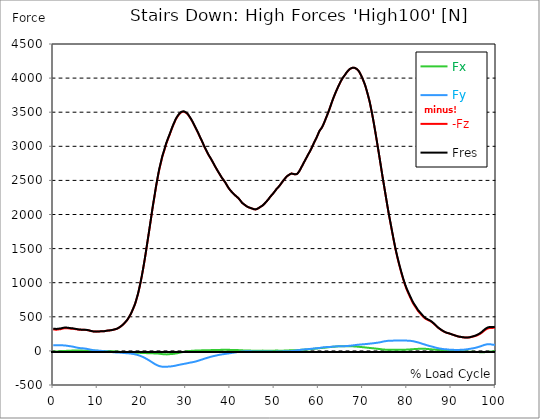
| Category |  Fx |  Fy |  -Fz |  Fres |
|---|---|---|---|---|
| 0.0 | -10.262 | 84.276 | 312.61 | 324.099 |
| 0.167348456675344 | -9.991 | 84.443 | 312.683 | 324.202 |
| 0.334696913350688 | -9.638 | 84.463 | 312.413 | 323.943 |
| 0.5020453700260321 | -8.972 | 83.944 | 310.884 | 322.31 |
| 0.669393826701376 | -8.369 | 83.767 | 310.759 | 322.134 |
| 0.83674228337672 | -7.725 | 83.548 | 311.456 | 322.757 |
| 1.0040907400520642 | -6.997 | 83.6 | 313.525 | 324.764 |
| 1.1621420602454444 | -6.311 | 83.372 | 315.376 | 326.5 |
| 1.3294905169207885 | -5.614 | 82.841 | 316.675 | 327.613 |
| 1.4968389735961325 | -4.824 | 82.28 | 317.549 | 328.309 |
| 1.6641874302714765 | -4.117 | 81.802 | 318.911 | 329.515 |
| 1.8315358869468206 | -3.483 | 81.521 | 321.427 | 331.886 |
| 1.9988843436221646 | -2.932 | 81.396 | 324.868 | 335.202 |
| 2.1662328002975086 | -2.308 | 81.251 | 328.008 | 338.228 |
| 2.333581256972853 | -1.809 | 80.845 | 330.524 | 340.609 |
| 2.5009297136481967 | -1.268 | 79.941 | 331.979 | 341.846 |
| 2.6682781703235405 | -0.707 | 78.859 | 332.582 | 342.189 |
| 2.8356266269988843 | -0.177 | 77.695 | 332.717 | 342.064 |
| 3.002975083674229 | 0.78 | 76.479 | 332.842 | 341.887 |
| 3.1703235403495724 | 1.216 | 74.555 | 332.156 | 340.868 |
| 3.337671997024917 | 1.653 | 72.725 | 331.355 | 339.735 |
| 3.4957233172182973 | 2.131 | 71.197 | 330.118 | 338.207 |
| 3.663071773893641 | 2.672 | 69.669 | 328.205 | 336.013 |
| 3.8304202305689854 | 3.161 | 68.099 | 326.282 | 333.819 |
| 3.997768687244329 | 3.566 | 66.862 | 325.325 | 332.582 |
| 4.165117143919673 | 4.252 | 65.094 | 324.826 | 331.688 |
| 4.332465600595017 | 4.99 | 63.088 | 324.587 | 331.002 |
| 4.499814057270361 | 5.302 | 61.143 | 323.787 | 329.817 |
| 4.667162513945706 | 5.718 | 58.731 | 322.487 | 328.132 |
| 4.834510970621049 | 6.259 | 55.56 | 320.813 | 325.939 |
| 5.001859427296393 | 6.488 | 52.587 | 318.9 | 323.579 |
| 5.169207883971737 | 6.571 | 50.445 | 317.237 | 321.645 |
| 5.336556340647081 | 6.727 | 48.303 | 315.677 | 319.815 |
| 5.503904797322425 | 6.81 | 46.078 | 313.826 | 317.725 |
| 5.671253253997769 | 6.831 | 43.989 | 312.111 | 315.781 |
| 5.82930457419115 | 6.571 | 42.575 | 311.04 | 314.554 |
| 5.996653030866494 | 6.28 | 41.254 | 310.052 | 313.431 |
| 6.164001487541838 | 5.957 | 40.08 | 309.138 | 312.371 |
| 6.331349944217181 | 5.354 | 39.196 | 308.389 | 311.529 |
| 6.498698400892526 | 4.575 | 38.499 | 308.41 | 311.466 |
| 6.66604685756787 | 4.003 | 37.771 | 308.815 | 311.81 |
| 6.833395314243213 | 3.525 | 36.805 | 308.982 | 311.903 |
| 7.000743770918558 | 3.181 | 35.557 | 308.763 | 311.57 |
| 7.168092227593902 | 3.088 | 33.987 | 308.098 | 310.78 |
| 7.335440684269246 | 3.192 | 32.313 | 307.162 | 309.647 |
| 7.50278914094459 | 3.348 | 30.65 | 305.8 | 308.119 |
| 7.6701375976199335 | 3.535 | 28.882 | 304.272 | 306.403 |
| 7.837486054295278 | 3.764 | 26.657 | 302.629 | 304.563 |
| 7.995537374488658 | 4.086 | 24.162 | 300.467 | 302.161 |
| 8.162885831164003 | 4.377 | 21.49 | 297.42 | 298.824 |
| 8.330234287839346 | 4.491 | 18.953 | 294.582 | 295.726 |
| 8.49758274451469 | 4.533 | 16.51 | 291.941 | 292.825 |
| 8.664931201190035 | 4.252 | 14.483 | 289.571 | 290.257 |
| 8.832279657865378 | 3.743 | 12.85 | 287.668 | 288.25 |
| 8.999628114540721 | 3.4 | 11.156 | 285.807 | 286.306 |
| 9.166976571216066 | 3.046 | 9.492 | 284.019 | 284.445 |
| 9.334325027891412 | 2.422 | 8.494 | 283.385 | 283.769 |
| 9.501673484566755 | 1.871 | 7.558 | 282.803 | 283.166 |
| 9.669021941242098 | 1.435 | 6.592 | 282.459 | 282.782 |
| 9.836370397917442 | 0.967 | 5.666 | 282.699 | 283 |
| 10.003718854592787 | 0.416 | 4.886 | 283.374 | 283.665 |
| 10.17106731126813 | -0.198 | 4.148 | 284.165 | 284.435 |
| 10.329118631461512 | -0.957 | 3.722 | 285.901 | 286.14 |
| 10.496467088136853 | -1.092 | 2.807 | 286.161 | 286.348 |
| 10.663815544812199 | -1.081 | 1.643 | 286.233 | 286.358 |
| 10.831164001487544 | -0.936 | 0.208 | 286.223 | 286.296 |
| 10.998512458162887 | -1.279 | -0.676 | 286.483 | 286.556 |
| 11.16586091483823 | -1.726 | -1.456 | 286.816 | 286.878 |
| 11.333209371513574 | -2.308 | -2.547 | 287.46 | 287.543 |
| 11.50055782818892 | -2.859 | -3.691 | 288.646 | 288.749 |
| 11.667906284864264 | -3.213 | -4.98 | 290.611 | 290.766 |
| 11.835254741539607 | -3.576 | -6.113 | 292.7 | 292.887 |
| 12.00260319821495 | -4.211 | -6.664 | 295.112 | 295.341 |
| 12.169951654890292 | -4.679 | -7.652 | 297.264 | 297.524 |
| 12.337300111565641 | -4.741 | -9.336 | 298.034 | 298.346 |
| 12.504648568240984 | -4.803 | -10.865 | 298.803 | 299.167 |
| 12.662699888434362 | -4.928 | -12.414 | 300.124 | 300.55 |
| 12.830048345109708 | -4.876 | -13.911 | 301.434 | 301.912 |
| 12.997396801785053 | -5.001 | -15.325 | 302.764 | 303.295 |
| 13.164745258460396 | -5.282 | -16.614 | 304.261 | 304.864 |
| 13.33209371513574 | -5.76 | -17.747 | 306.237 | 306.923 |
| 13.499442171811083 | -6.311 | -18.756 | 308.659 | 309.408 |
| 13.666790628486426 | -7.049 | -19.598 | 311.664 | 312.475 |
| 13.834139085161771 | -7.351 | -20.835 | 314.284 | 315.168 |
| 14.001487541837117 | -7.933 | -21.792 | 317.122 | 318.079 |
| 14.16883599851246 | -8.785 | -22.478 | 320.179 | 321.198 |
| 14.336184455187803 | -9.887 | -23.039 | 323.828 | 324.93 |
| 14.503532911863147 | -10.948 | -23.528 | 328.621 | 329.775 |
| 14.670881368538492 | -11.925 | -24.11 | 334.246 | 335.452 |
| 14.828932688731873 | -12.819 | -24.692 | 340.619 | 341.877 |
| 14.996281145407215 | -13.848 | -25.337 | 347.356 | 348.666 |
| 15.163629602082558 | -14.67 | -26.013 | 354.395 | 355.767 |
| 15.330978058757903 | -15.252 | -26.751 | 362.535 | 363.96 |
| 15.498326515433247 | -16.157 | -27.801 | 371.248 | 372.755 |
| 15.665674972108594 | -17.134 | -29.173 | 380.688 | 382.32 |
| 15.833023428783937 | -17.893 | -30.203 | 390.752 | 392.478 |
| 16.00037188545928 | -18.766 | -31.024 | 401.43 | 403.218 |
| 16.167720342134626 | -19.484 | -31.752 | 412.991 | 414.852 |
| 16.335068798809967 | -19.941 | -32.687 | 425.238 | 427.162 |
| 16.502417255485312 | -20.378 | -33.769 | 437.444 | 439.44 |
| 16.669765712160658 | -21.012 | -34.694 | 450.003 | 452.062 |
| 16.837114168836 | -21.646 | -35.443 | 465.432 | 467.532 |
| 17.004462625511344 | -22.363 | -36.17 | 483.367 | 485.519 |
| 17.16251394570472 | -23.122 | -36.857 | 501.436 | 503.62 |
| 17.32986240238007 | -23.715 | -37.719 | 520.015 | 522.251 |
| 17.497210859055414 | -23.933 | -39.071 | 539.738 | 542.004 |
| 17.664559315730756 | -24.193 | -40.766 | 561.821 | 564.129 |
| 17.8319077724061 | -24.422 | -42.668 | 587.064 | 589.414 |
| 17.999256229081443 | -25.129 | -44.644 | 612.495 | 614.917 |
| 18.166604685756788 | -25.919 | -46.609 | 638.123 | 640.628 |
| 18.333953142432133 | -26.46 | -48.355 | 663.792 | 666.339 |
| 18.501301599107478 | -26.855 | -50.549 | 693.475 | 696.095 |
| 18.668650055782823 | -27.26 | -53.304 | 728.387 | 731.101 |
| 18.835998512458165 | -27.635 | -56.184 | 765.629 | 768.436 |
| 19.00334696913351 | -27.843 | -58.887 | 803.514 | 806.394 |
| 19.170695425808855 | -28.071 | -61.85 | 843.677 | 846.64 |
| 19.338043882484197 | -28.3 | -65.292 | 890.036 | 893.114 |
| 19.496095202677576 | -28.799 | -69.305 | 938.205 | 941.448 |
| 19.66344365935292 | -29.132 | -73.412 | 988.993 | 992.392 |
| 19.830792116028263 | -29.36 | -77.539 | 1041.902 | 1045.447 |
| 19.998140572703612 | -29.693 | -81.927 | 1097.161 | 1100.852 |
| 20.165489029378953 | -30.14 | -86.886 | 1155.736 | 1159.625 |
| 20.3328374860543 | -30.66 | -92.157 | 1216.963 | 1221.059 |
| 20.500185942729644 | -31.18 | -97.376 | 1279.853 | 1284.157 |
| 20.667534399404985 | -31.658 | -102.72 | 1344.126 | 1348.627 |
| 20.83488285608033 | -32.209 | -108.532 | 1411.361 | 1416.102 |
| 21.002231312755672 | -32.677 | -114.624 | 1481.041 | 1486.021 |
| 21.16957976943102 | -33.062 | -120.852 | 1551.302 | 1556.542 |
| 21.336928226106362 | -33.706 | -127.028 | 1621.491 | 1626.991 |
| 21.504276682781704 | -34.361 | -133.224 | 1691.679 | 1697.439 |
| 21.67162513945705 | -34.954 | -139.535 | 1761.941 | 1767.96 |
| 21.82967645965043 | -35.151 | -146.251 | 1832.815 | 1839.126 |
| 21.997024916325774 | -35.37 | -153.342 | 1905.385 | 1912.008 |
| 22.16437337300112 | -35.588 | -160.443 | 1978.037 | 1984.982 |
| 22.33172182967646 | -35.744 | -167.679 | 2051.407 | 2058.675 |
| 22.499070286351806 | -36.046 | -174.583 | 2121.502 | 2129.092 |
| 22.666418743027148 | -36.347 | -181.247 | 2187.085 | 2194.997 |
| 22.833767199702496 | -36.638 | -187.901 | 2252.221 | 2260.445 |
| 23.00111565637784 | -36.805 | -194.628 | 2319.27 | 2327.816 |
| 23.168464113053183 | -37.044 | -200.918 | 2386.693 | 2395.53 |
| 23.335812569728528 | -37.709 | -206.23 | 2449.177 | 2458.243 |
| 23.50316102640387 | -38.447 | -210.982 | 2507.909 | 2517.172 |
| 23.670509483079215 | -39.175 | -215.65 | 2566.006 | 2575.446 |
| 23.83785793975456 | -40.007 | -220.152 | 2623.417 | 2633.044 |
| 23.995909259947936 | -41.421 | -223.375 | 2674.371 | 2684.103 |
| 24.163257716623285 | -42.783 | -225.797 | 2718.859 | 2728.653 |
| 24.330606173298627 | -44.342 | -228.261 | 2764.366 | 2774.222 |
| 24.49795462997397 | -45.902 | -230.725 | 2809.873 | 2819.802 |
| 24.665303086649313 | -47.295 | -232.669 | 2853.612 | 2863.562 |
| 24.83265154332466 | -48.449 | -233.324 | 2888.285 | 2898.193 |
| 25.0 | -49.457 | -233.823 | 2922.833 | 2932.669 |
| 25.167348456675345 | -50.268 | -234.073 | 2959.014 | 2968.756 |
| 25.334696913350694 | -50.819 | -234.166 | 2996.63 | 3006.268 |
| 25.502045370026035 | -51.152 | -233.751 | 3032.415 | 3041.908 |
| 25.669393826701377 | -51.048 | -232.659 | 3062.878 | 3072.193 |
| 25.836742283376722 | -50.799 | -231.38 | 3091.875 | 3101.003 |
| 26.004090740052067 | -50.715 | -229.997 | 3120.767 | 3129.698 |
| 26.17143919672741 | -48.657 | -229.675 | 3148.256 | 3157.062 |
| 26.329490516920792 | -46.702 | -229.311 | 3176.369 | 3185.04 |
| 26.49683897359613 | -45.579 | -228.427 | 3206.281 | 3214.785 |
| 26.66418743027148 | -45.278 | -226.629 | 3235.797 | 3244.104 |
| 26.831535886946828 | -45.392 | -224.466 | 3265.074 | 3273.163 |
| 26.998884343622166 | -44.665 | -223.26 | 3292.532 | 3300.465 |
| 27.166232800297514 | -43.531 | -221.753 | 3318.857 | 3326.623 |
| 27.333581256972852 | -41.608 | -219.996 | 3343.081 | 3350.65 |
| 27.5009297136482 | -40.028 | -217.334 | 3368.034 | 3375.353 |
| 27.668278170323543 | -38.271 | -215.411 | 3393.017 | 3400.149 |
| 27.835626626998888 | -36.565 | -212.344 | 3411.7 | 3418.583 |
| 28.002975083674233 | -34.58 | -209.817 | 3429.395 | 3436.07 |
| 28.170323540349575 | -32.407 | -207.759 | 3446.155 | 3452.674 |
| 28.33767199702492 | -30.036 | -205.69 | 3460.825 | 3467.167 |
| 28.50502045370026 | -27.344 | -203.548 | 3474.07 | 3480.267 |
| 28.663071773893645 | -24.963 | -201.032 | 3485.923 | 3491.942 |
| 28.830420230568986 | -22.852 | -198.745 | 3494.604 | 3500.478 |
| 28.99776868724433 | -20.606 | -196.904 | 3500.364 | 3506.123 |
| 29.165117143919673 | -18.319 | -194.95 | 3504.668 | 3510.303 |
| 29.33246560059502 | -16.053 | -192.787 | 3508.38 | 3513.9 |
| 29.499814057270367 | -13.724 | -190.822 | 3507.433 | 3512.85 |
| 29.66716251394571 | -11.759 | -188.681 | 3502.474 | 3507.787 |
| 29.834510970621054 | -9.721 | -186.726 | 3496.87 | 3502.09 |
| 30.00185942729639 | -7.922 | -184.501 | 3491.163 | 3496.278 |
| 30.169207883971744 | -6.269 | -182.193 | 3483.479 | 3488.48 |
| 30.33655634064708 | -4.72 | -179.906 | 3473.207 | 3478.115 |
| 30.50390479732243 | -3.15 | -177.712 | 3459.4 | 3464.224 |
| 30.671253253997772 | -1.819 | -175.529 | 3443.774 | 3448.505 |
| 30.829304574191156 | -0.977 | -173.335 | 3426.619 | 3431.267 |
| 30.996653030866494 | -0.083 | -171.214 | 3410.224 | 3414.788 |
| 31.164001487541842 | 0.697 | -169.239 | 3393.682 | 3398.163 |
| 31.331349944217187 | 1.019 | -167.242 | 3373.585 | 3378.004 |
| 31.498698400892525 | 1.674 | -165.142 | 3353.925 | 3358.261 |
| 31.666046857567874 | 2.734 | -162.865 | 3332.955 | 3337.218 |
| 31.833395314243212 | 3.576 | -160.609 | 3310.144 | 3314.334 |
| 32.00074377091856 | 4.45 | -158.405 | 3288.8 | 3292.907 |
| 32.1680922275939 | 5.23 | -155.816 | 3268.963 | 3272.986 |
| 32.33544068426925 | 5.448 | -152.739 | 3247.629 | 3251.517 |
| 32.50278914094459 | 5.417 | -149.381 | 3225.598 | 3229.341 |
| 32.670137597619934 | 5.5 | -145.794 | 3203.359 | 3206.956 |
| 32.83748605429528 | 5.708 | -142.467 | 3180.569 | 3184.052 |
| 33.004834510970625 | 6.706 | -138.506 | 3156.095 | 3159.443 |
| 33.162885831164004 | 7.371 | -134.867 | 3132.536 | 3135.759 |
| 33.33023428783935 | 7.631 | -131.893 | 3110.36 | 3113.489 |
| 33.497582744514695 | 7.714 | -129.003 | 3087.976 | 3091.022 |
| 33.664931201190036 | 7.777 | -125.499 | 3064.469 | 3067.401 |
| 33.83227965786538 | 8.109 | -121.809 | 3041.18 | 3043.977 |
| 33.99962811454073 | 8.432 | -117.338 | 3014.699 | 3017.361 |
| 34.16697657121607 | 8.453 | -113.741 | 2991.036 | 2993.584 |
| 34.33432502789141 | 8.827 | -110.424 | 2969.016 | 2971.459 |
| 34.50167348456676 | 9.139 | -107.274 | 2947.401 | 2949.751 |
| 34.6690219412421 | 9.503 | -104.196 | 2926.212 | 2928.479 |
| 34.83637039791744 | 9.877 | -101.025 | 2904.93 | 2907.124 |
| 35.00371885459279 | 10.251 | -97.865 | 2884.022 | 2886.133 |
| 35.17106731126814 | 10.667 | -94.673 | 2864.539 | 2866.556 |
| 35.338415767943474 | 11.01 | -91.242 | 2847.062 | 2848.964 |
| 35.49646708813686 | 11.27 | -87.79 | 2830.032 | 2831.82 |
| 35.6638155448122 | 11.468 | -84.734 | 2811.391 | 2813.096 |
| 35.831164001487544 | 11.676 | -82.051 | 2792.156 | 2793.799 |
| 35.998512458162885 | 11.915 | -79.4 | 2772.86 | 2774.44 |
| 36.165860914838234 | 12.143 | -76.884 | 2753.21 | 2754.739 |
| 36.333209371513576 | 12.362 | -74.472 | 2732.697 | 2734.174 |
| 36.50055782818892 | 12.58 | -72.102 | 2712.476 | 2713.9 |
| 36.667906284864266 | 12.798 | -69.773 | 2693.314 | 2694.676 |
| 36.83525474153961 | 13.017 | -67.402 | 2674.694 | 2676.004 |
| 37.002603198214956 | 13.225 | -64.928 | 2656.021 | 2657.269 |
| 37.1699516548903 | 13.433 | -62.443 | 2637.463 | 2638.648 |
| 37.337300111565646 | 13.713 | -60.145 | 2619.414 | 2620.547 |
| 37.50464856824098 | 14.119 | -57.983 | 2601.812 | 2602.894 |
| 37.66269988843437 | 14.618 | -56.007 | 2584.107 | 2585.146 |
| 37.83004834510971 | 15.138 | -54.094 | 2566.224 | 2567.222 |
| 37.99739680178505 | 15.678 | -52.192 | 2548.727 | 2549.683 |
| 38.16474525846039 | 15.969 | -50.404 | 2531.915 | 2532.84 |
| 38.33209371513574 | 16.396 | -48.813 | 2517.432 | 2518.316 |
| 38.49944217181109 | 16.406 | -47.388 | 2503.469 | 2504.312 |
| 38.666790628486424 | 16.115 | -45.964 | 2489.444 | 2490.255 |
| 38.83413908516178 | 15.845 | -44.436 | 2472.726 | 2473.527 |
| 39.001487541837115 | 15.886 | -42.616 | 2455.551 | 2456.31 |
| 39.16883599851246 | 15.71 | -41.046 | 2436.088 | 2436.836 |
| 39.336184455187805 | 15.793 | -39.508 | 2417.81 | 2418.549 |
| 39.503532911863154 | 15.741 | -38 | 2399.772 | 2400.5 |
| 39.670881368538495 | 15.47 | -36.399 | 2383.459 | 2384.166 |
| 39.83822982521384 | 15.21 | -34.548 | 2369.164 | 2369.829 |
| 39.996281145407224 | 14.909 | -32.781 | 2355.607 | 2356.251 |
| 40.163629602082565 | 14.68 | -31.034 | 2342.839 | 2343.453 |
| 40.33097805875791 | 14.503 | -29.298 | 2330.467 | 2331.07 |
| 40.498326515433256 | 14.597 | -27.676 | 2319.187 | 2319.758 |
| 40.6656749721086 | 14.909 | -26.179 | 2308.738 | 2309.299 |
| 40.83302342878393 | 15.055 | -24.848 | 2297.52 | 2298.071 |
| 41.00037188545929 | 14.878 | -23.206 | 2286.666 | 2287.217 |
| 41.16772034213463 | 14.368 | -21.459 | 2275.624 | 2276.165 |
| 41.33506879880997 | 13.63 | -19.473 | 2267.806 | 2268.305 |
| 41.50241725548531 | 12.913 | -17.862 | 2256.952 | 2257.44 |
| 41.66976571216066 | 12.258 | -16.157 | 2249.102 | 2249.57 |
| 41.837114168836 | 11.405 | -14.285 | 2239.215 | 2239.662 |
| 42.004462625511344 | 10.677 | -12.975 | 2227.57 | 2228.007 |
| 42.17181108218669 | 10.064 | -11.935 | 2213.878 | 2214.314 |
| 42.32986240238007 | 9.451 | -10.885 | 2199.218 | 2199.645 |
| 42.497210859055414 | 8.848 | -9.835 | 2185.037 | 2185.463 |
| 42.66455931573076 | 8.276 | -8.764 | 2171.667 | 2172.093 |
| 42.831907772406105 | 7.714 | -7.902 | 2160.636 | 2161.073 |
| 42.999256229081446 | 7.299 | -7.527 | 2153.4 | 2153.836 |
| 43.16660468575679 | 6.872 | -7.153 | 2146.164 | 2146.6 |
| 43.33395314243214 | 6.321 | -6.748 | 2138.148 | 2138.584 |
| 43.50130159910748 | 5.635 | -6.321 | 2129.269 | 2129.716 |
| 43.66865005578282 | 5.302 | -6.093 | 2121.762 | 2122.209 |
| 43.83599851245817 | 5.136 | -5.926 | 2114.849 | 2115.306 |
| 44.00334696913351 | 4.97 | -5.645 | 2108.943 | 2109.401 |
| 44.17069542580886 | 4.814 | -5.105 | 2104.94 | 2105.398 |
| 44.3380438824842 | 4.689 | -5.323 | 2101.01 | 2101.468 |
| 44.49609520267758 | 4.585 | -5.791 | 2097.112 | 2097.569 |
| 44.66344365935292 | 4.076 | -6.394 | 2093.358 | 2093.816 |
| 44.83079211602827 | 3.431 | -7.049 | 2089.668 | 2090.125 |
| 44.99814057270361 | 2.859 | -7.506 | 2085.831 | 2086.289 |
| 45.16548902937895 | 2.443 | -7.579 | 2081.724 | 2082.182 |
| 45.332837486054295 | 2.048 | -7.61 | 2077.94 | 2078.387 |
| 45.500185942729644 | 1.788 | -7.34 | 2076.089 | 2076.547 |
| 45.66753439940499 | 1.518 | -7.08 | 2074.249 | 2074.696 |
| 45.83488285608033 | 1.611 | -7.122 | 2076.505 | 2076.952 |
| 46.00223131275568 | 1.622 | -7.091 | 2079.739 | 2080.186 |
| 46.16957976943102 | 1.715 | -7.153 | 2084.532 | 2084.979 |
| 46.336928226106366 | 1.965 | -7.288 | 2090.863 | 2091.3 |
| 46.50427668278171 | 2.433 | -7.444 | 2097.923 | 2098.359 |
| 46.671625139457056 | 2.89 | -7.59 | 2104.982 | 2105.419 |
| 46.829676459650436 | 3.327 | -7.673 | 2112.052 | 2112.499 |
| 46.99702491632577 | 3.691 | -7.558 | 2119.184 | 2119.621 |
| 47.16437337300112 | 4.065 | -7.434 | 2126.306 | 2126.753 |
| 47.33172182967646 | 4.128 | -7.652 | 2133.022 | 2133.48 |
| 47.49907028635181 | 4.283 | -7.891 | 2140.913 | 2141.371 |
| 47.66641874302716 | 3.753 | -8.037 | 2153.597 | 2154.055 |
| 47.83376719970249 | 3.265 | -8.401 | 2164.535 | 2164.992 |
| 48.001115656377834 | 3.129 | -8.692 | 2176.876 | 2177.333 |
| 48.16846411305319 | 3.171 | -9.045 | 2188.167 | 2188.624 |
| 48.33581256972853 | 2.911 | -9.232 | 2201.578 | 2202.036 |
| 48.50316102640387 | 2.714 | -9.367 | 2214.398 | 2214.855 |
| 48.67050948307921 | 2.568 | -9.471 | 2226.749 | 2227.206 |
| 48.837857939754564 | 2.506 | -9.575 | 2241.252 | 2241.72 |
| 49.005206396429905 | 2.578 | -9.721 | 2256.068 | 2256.536 |
| 49.163257716623285 | 2.828 | -10.002 | 2268.918 | 2269.386 |
| 49.33060617329863 | 3.057 | -10.251 | 2281.893 | 2282.361 |
| 49.49795462997397 | 3.223 | -10.625 | 2293.819 | 2294.297 |
| 49.66530308664932 | 3.545 | -10.958 | 2306.232 | 2306.711 |
| 49.832651543324666 | 3.753 | -11.031 | 2319.332 | 2319.81 |
| 50.0 | 3.909 | -11.01 | 2332.63 | 2333.118 |
| 50.16734845667534 | 4.055 | -10.844 | 2347.528 | 2348.017 |
| 50.33469691335069 | 4.263 | -10.615 | 2362.666 | 2363.165 |
| 50.50204537002604 | 4.647 | -10.293 | 2377.419 | 2377.918 |
| 50.66939382670139 | 4.533 | -9.96 | 2389.853 | 2390.342 |
| 50.836742283376715 | 4.076 | -9.326 | 2398.66 | 2399.117 |
| 51.00409074005207 | 3.576 | -8.848 | 2411.531 | 2411.978 |
| 51.17143919672741 | 3.379 | -8.473 | 2424.548 | 2424.984 |
| 51.32949051692079 | 3.129 | -8.089 | 2438.947 | 2439.373 |
| 51.496838973596134 | 2.984 | -7.746 | 2453.783 | 2454.199 |
| 51.66418743027148 | 3.088 | -7.527 | 2468.297 | 2468.713 |
| 51.831535886946824 | 3.317 | -7.247 | 2483.216 | 2483.632 |
| 51.99888434362217 | 3.649 | -6.737 | 2497.159 | 2497.564 |
| 52.16623280029752 | 4.46 | -6.415 | 2510.861 | 2511.277 |
| 52.33358125697285 | 5.209 | -6.124 | 2524.523 | 2524.928 |
| 52.5009297136482 | 5.666 | -5.687 | 2537.706 | 2538.132 |
| 52.668278170323546 | 5.885 | -5.042 | 2550.255 | 2550.692 |
| 52.835626626998895 | 6.144 | -4.72 | 2560.444 | 2560.88 |
| 53.00297508367424 | 6.54 | -4.71 | 2568.22 | 2568.668 |
| 53.17032354034958 | 7.195 | -4.741 | 2576.548 | 2577.006 |
| 53.33767199702492 | 7.839 | -4.668 | 2584.356 | 2584.824 |
| 53.50502045370027 | 8.411 | -4.221 | 2590.085 | 2590.542 |
| 53.663071773893655 | 8.858 | -3.514 | 2596.375 | 2596.822 |
| 53.83042023056899 | 9.16 | -2.547 | 2600.419 | 2600.846 |
| 53.99776868724433 | 9.336 | -1.424 | 2601.604 | 2602 |
| 54.16511714391967 | 8.868 | 0.052 | 2596.209 | 2596.562 |
| 54.33246560059503 | 8.338 | 1.549 | 2591.561 | 2591.884 |
| 54.49981405727037 | 8.037 | 2.984 | 2590.428 | 2590.719 |
| 54.667162513945705 | 8.359 | 5.011 | 2589.419 | 2589.679 |
| 54.834510970621054 | 9.108 | 7.351 | 2588.775 | 2589.014 |
| 55.0018594272964 | 10.095 | 9.17 | 2590.085 | 2590.314 |
| 55.169207883971744 | 11.021 | 10.085 | 2598.08 | 2598.309 |
| 55.336556340647086 | 11.967 | 11.01 | 2609.423 | 2609.662 |
| 55.50390479732243 | 12.975 | 12.164 | 2625.257 | 2625.507 |
| 55.671253253997776 | 14.004 | 13.36 | 2642.069 | 2642.329 |
| 55.83860171067312 | 14.795 | 14.867 | 2661.864 | 2662.134 |
| 55.9966530308665 | 15.429 | 16.541 | 2682.346 | 2682.647 |
| 56.16400148754184 | 16.177 | 17.914 | 2702.682 | 2702.994 |
| 56.33134994421718 | 16.895 | 19.099 | 2722.904 | 2723.226 |
| 56.498698400892536 | 17.456 | 20.471 | 2744.103 | 2744.446 |
| 56.66604685756788 | 18.142 | 21.542 | 2764.189 | 2764.543 |
| 56.83339531424321 | 18.87 | 22.561 | 2784.213 | 2784.588 |
| 57.00074377091856 | 19.639 | 23.382 | 2804.581 | 2804.965 |
| 57.16809222759391 | 20.357 | 24.183 | 2825.114 | 2825.52 |
| 57.33544068426925 | 20.918 | 25.025 | 2845.398 | 2845.814 |
| 57.5027891409446 | 21.604 | 25.94 | 2865.87 | 2866.306 |
| 57.670137597619934 | 22.332 | 26.792 | 2885.894 | 2886.351 |
| 57.83748605429528 | 23.393 | 27.468 | 2904.754 | 2905.221 |
| 58.004834510970625 | 24.578 | 28.279 | 2924.237 | 2924.726 |
| 58.16288583116401 | 25.732 | 29.475 | 2945.582 | 2946.091 |
| 58.330234287839346 | 26.803 | 30.847 | 2967.373 | 2967.914 |
| 58.497582744514695 | 28.092 | 32.105 | 2989.685 | 2990.246 |
| 58.66493120119004 | 29.371 | 33.311 | 3013.514 | 3014.107 |
| 58.832279657865385 | 30.764 | 34.413 | 3037.167 | 3037.78 |
| 58.999628114540734 | 32.084 | 35.515 | 3060.819 | 3061.464 |
| 59.16697657121607 | 33.031 | 36.711 | 3083.224 | 3083.869 |
| 59.33432502789142 | 33.779 | 38.031 | 3103.852 | 3104.517 |
| 59.50167348456676 | 34.663 | 39.248 | 3125.238 | 3125.914 |
| 59.66902194124211 | 36.191 | 39.986 | 3150.346 | 3151.043 |
| 59.83637039791745 | 37.605 | 40.88 | 3175.225 | 3175.943 |
| 60.00371885459278 | 39.133 | 41.67 | 3200.105 | 3200.843 |
| 60.17106731126813 | 40.412 | 42.627 | 3224.61 | 3225.369 |
| 60.33841576794349 | 41.005 | 44.717 | 3239.862 | 3240.642 |
| 60.49646708813685 | 41.733 | 46.817 | 3254.844 | 3255.644 |
| 60.6638155448122 | 42.959 | 48.813 | 3270.543 | 3271.396 |
| 60.831164001487544 | 44.062 | 50.487 | 3288.831 | 3289.715 |
| 60.99851245816289 | 44.966 | 51.682 | 3311.163 | 3312.078 |
| 61.16586091483824 | 45.943 | 53.221 | 3336.157 | 3337.103 |
| 61.333209371513576 | 47.014 | 54.282 | 3362.721 | 3363.698 |
| 61.50055782818892 | 48.168 | 54.885 | 3389.659 | 3390.647 |
| 61.667906284864266 | 49.364 | 55.321 | 3416.826 | 3417.834 |
| 61.835254741539615 | 50.57 | 55.633 | 3444.159 | 3445.188 |
| 62.002603198214956 | 51.88 | 55.893 | 3471.429 | 3472.469 |
| 62.16995165489029 | 53.294 | 56.361 | 3498.991 | 3500.041 |
| 62.33730011156564 | 54.573 | 57.213 | 3527.489 | 3528.56 |
| 62.504648568240995 | 55.737 | 58.295 | 3556.912 | 3558.014 |
| 62.67199702491633 | 57.099 | 59.054 | 3589.048 | 3590.171 |
| 62.83004834510971 | 58.243 | 60.083 | 3621.049 | 3622.193 |
| 62.99739680178505 | 59.199 | 61.372 | 3651.637 | 3652.811 |
| 63.1647452584604 | 59.989 | 62.433 | 3681.34 | 3682.536 |
| 63.33209371513575 | 60.769 | 63.493 | 3710.067 | 3711.283 |
| 63.4994421718111 | 61.59 | 64.366 | 3737.514 | 3738.762 |
| 63.666790628486424 | 62.443 | 65.063 | 3764.39 | 3765.648 |
| 63.83413908516177 | 63.441 | 65.656 | 3790.361 | 3791.64 |
| 64.00148754183712 | 64.398 | 66.425 | 3815.219 | 3816.519 |
| 64.16883599851248 | 65.416 | 66.799 | 3839.506 | 3840.827 |
| 64.3361844551878 | 66.467 | 67.122 | 3863.253 | 3864.594 |
| 64.50353291186315 | 67.506 | 67.319 | 3887.03 | 3888.392 |
| 64.6708813685385 | 68.109 | 67.621 | 3909.747 | 3911.119 |
| 64.83822982521384 | 68.452 | 67.881 | 3931.715 | 3933.098 |
| 65.00557828188919 | 68.66 | 68.099 | 3953.143 | 3954.526 |
| 65.16362960208257 | 68.816 | 68.286 | 3973.5 | 3974.883 |
| 65.3309780587579 | 69.066 | 68.38 | 3991.684 | 3993.067 |
| 65.49832651543326 | 69.222 | 68.712 | 4008.267 | 4009.639 |
| 65.6656749721086 | 69.627 | 69.326 | 4022.801 | 4024.195 |
| 65.83302342878395 | 69.825 | 69.752 | 4037.367 | 4038.771 |
| 66.00037188545929 | 69.565 | 69.918 | 4052.775 | 4054.179 |
| 66.16772034213463 | 69.087 | 70.49 | 4068.63 | 4070.034 |
| 66.33506879880998 | 68.889 | 71.176 | 4083.622 | 4085.036 |
| 66.50241725548531 | 68.868 | 71.873 | 4097.72 | 4099.145 |
| 66.66976571216065 | 69.222 | 72.84 | 4109.417 | 4110.872 |
| 66.83711416883601 | 69.326 | 74.42 | 4120.261 | 4121.737 |
| 67.00446262551135 | 69.43 | 76 | 4131.094 | 4132.602 |
| 67.1718110821867 | 69.326 | 76.614 | 4137.187 | 4138.705 |
| 67.32986240238007 | 69.222 | 77.456 | 4142.978 | 4144.516 |
| 67.49721085905541 | 68.515 | 78.704 | 4147.739 | 4149.288 |
| 67.66455931573076 | 67.485 | 80.034 | 4150.682 | 4152.241 |
| 67.83190777240611 | 66.924 | 81.376 | 4152.563 | 4154.133 |
| 67.99925622908145 | 65.832 | 82.706 | 4151.69 | 4153.281 |
| 68.16660468575678 | 65.042 | 84.12 | 4148.301 | 4149.912 |
| 68.33395314243214 | 64.283 | 85.742 | 4142.427 | 4144.069 |
| 68.50130159910749 | 63.566 | 87.281 | 4136.168 | 4137.831 |
| 68.66865005578282 | 62.765 | 88.612 | 4128.838 | 4130.512 |
| 68.83599851245816 | 61.663 | 89.662 | 4118.899 | 4120.593 |
| 69.00334696913352 | 60.457 | 90.722 | 4105.882 | 4107.597 |
| 69.17069542580886 | 59.345 | 91.835 | 4090.567 | 4092.293 |
| 69.3380438824842 | 58.18 | 92.916 | 4070.398 | 4072.144 |
| 69.50539233915956 | 57.141 | 93.883 | 4049.646 | 4051.403 |
| 69.66344365935292 | 56.122 | 94.85 | 4026.794 | 4028.572 |
| 69.83079211602826 | 55.103 | 95.827 | 4002.881 | 4004.68 |
| 69.99814057270362 | 54.167 | 96.721 | 3977.305 | 3979.125 |
| 70.16548902937896 | 53.138 | 97.646 | 3949.951 | 3951.781 |
| 70.33283748605429 | 51.953 | 98.717 | 3921.963 | 3923.814 |
| 70.50018594272964 | 50.757 | 99.674 | 3892.613 | 3894.495 |
| 70.667534399405 | 49.447 | 100.454 | 3856.703 | 3858.595 |
| 70.83488285608033 | 48.012 | 101.576 | 3819.659 | 3821.572 |
| 71.00223131275568 | 46.775 | 102.658 | 3781.18 | 3783.114 |
| 71.16957976943102 | 45.735 | 103.687 | 3740.124 | 3742.099 |
| 71.33692822610637 | 44.685 | 104.779 | 3698.266 | 3700.262 |
| 71.50427668278171 | 43.5 | 106.172 | 3656.606 | 3658.654 |
| 71.67162513945706 | 42.346 | 107.44 | 3606.619 | 3608.708 |
| 71.8389735961324 | 41.265 | 108.49 | 3552.192 | 3554.323 |
| 71.99702491632577 | 40.215 | 109.509 | 3497.265 | 3499.438 |
| 72.16437337300113 | 39.185 | 110.726 | 3441.393 | 3443.618 |
| 72.33172182967647 | 38.063 | 111.921 | 3381.934 | 3384.232 |
| 72.49907028635181 | 36.742 | 113.366 | 3321.113 | 3323.473 |
| 72.66641874302715 | 35.536 | 114.988 | 3258.348 | 3260.791 |
| 72.8337671997025 | 34.444 | 116.319 | 3194.938 | 3197.443 |
| 73.00111565637783 | 33.166 | 117.702 | 3129.251 | 3131.84 |
| 73.16846411305319 | 31.928 | 118.949 | 3064.063 | 3066.735 |
| 73.33581256972853 | 30.754 | 120.655 | 2998.574 | 3001.35 |
| 73.50316102640387 | 29.579 | 122.36 | 2932.305 | 2935.195 |
| 73.67050948307921 | 28.425 | 123.919 | 2865.371 | 2868.386 |
| 73.83785793975457 | 27.084 | 125.832 | 2797.292 | 2800.453 |
| 74.00520639642991 | 25.586 | 128.275 | 2729.183 | 2732.531 |
| 74.16325771662328 | 23.85 | 130.594 | 2658.911 | 2662.436 |
| 74.33060617329863 | 22.655 | 132.892 | 2590.428 | 2594.14 |
| 74.49795462997398 | 21.376 | 135.283 | 2523.234 | 2527.164 |
| 74.66530308664932 | 20.357 | 138.152 | 2459.522 | 2463.723 |
| 74.83265154332466 | 19.556 | 140.086 | 2395.197 | 2399.626 |
| 75.00000000000001 | 18.641 | 141.854 | 2329.573 | 2334.262 |
| 75.16734845667534 | 18.07 | 143.455 | 2264.011 | 2268.949 |
| 75.3346969133507 | 17.799 | 145.129 | 2198.272 | 2203.491 |
| 75.50204537002605 | 17.934 | 146.865 | 2133.552 | 2139.083 |
| 75.66939382670138 | 18.049 | 148.019 | 2069.945 | 2075.725 |
| 75.83674228337672 | 18.111 | 148.851 | 2008.271 | 2014.281 |
| 76.00409074005208 | 17.934 | 149.142 | 1950.018 | 1956.235 |
| 76.17143919672742 | 17.726 | 149.474 | 1892.877 | 1899.313 |
| 76.33878765340276 | 17.487 | 149.807 | 1834.697 | 1841.393 |
| 76.49683897359614 | 17.435 | 150.098 | 1777.099 | 1784.055 |
| 76.66418743027148 | 17.3 | 150.296 | 1719.875 | 1727.091 |
| 76.83153588694682 | 17.217 | 150.472 | 1662.766 | 1670.293 |
| 76.99888434362218 | 17.279 | 150.992 | 1606.883 | 1614.774 |
| 77.16623280029752 | 17.238 | 151.294 | 1551.208 | 1559.422 |
| 77.33358125697285 | 17.175 | 151.845 | 1498.31 | 1506.845 |
| 77.5009297136482 | 17.02 | 152.23 | 1450.121 | 1458.999 |
| 77.66827817032356 | 16.78 | 152.604 | 1402.16 | 1411.351 |
| 77.83562662699889 | 16.749 | 152.812 | 1356.342 | 1365.865 |
| 78.00297508367423 | 16.832 | 152.947 | 1312.124 | 1321.97 |
| 78.17032354034959 | 16.968 | 153.009 | 1269.113 | 1279.281 |
| 78.33767199702493 | 17.061 | 152.999 | 1227.848 | 1238.349 |
| 78.50502045370027 | 17.134 | 152.853 | 1187.155 | 1197.989 |
| 78.67236891037561 | 17.311 | 152.791 | 1147.533 | 1158.71 |
| 78.83042023056899 | 17.487 | 152.936 | 1108.919 | 1120.46 |
| 78.99776868724433 | 17.685 | 152.916 | 1071.533 | 1083.416 |
| 79.16511714391969 | 17.893 | 152.729 | 1035.955 | 1048.161 |
| 79.33246560059503 | 18.111 | 152.448 | 1002.238 | 1014.766 |
| 79.49981405727036 | 18.163 | 151.772 | 969.676 | 982.526 |
| 79.66716251394571 | 18.319 | 151.242 | 938.818 | 951.98 |
| 79.83451097062107 | 18.714 | 150.961 | 909.416 | 922.88 |
| 80.00185942729641 | 19.192 | 150.566 | 884.017 | 897.803 |
| 80.16920788397174 | 19.712 | 150.14 | 859.085 | 873.194 |
| 80.33655634064709 | 20.357 | 149.745 | 834.809 | 849.271 |
| 80.50390479732243 | 21.261 | 149.121 | 810.927 | 825.711 |
| 80.67125325399778 | 22.083 | 148.092 | 787.264 | 802.246 |
| 80.83860171067312 | 22.811 | 146.802 | 763.861 | 778.988 |
| 80.99665303086651 | 23.663 | 145.347 | 740.978 | 756.24 |
| 81.16400148754184 | 24.484 | 143.798 | 718.77 | 734.178 |
| 81.3313499442172 | 25.368 | 141.874 | 698.102 | 713.52 |
| 81.49869840089255 | 26.189 | 139.67 | 679.616 | 694.962 |
| 81.66604685756786 | 26.824 | 137.092 | 663.418 | 678.608 |
| 81.83339531424322 | 27.468 | 134.087 | 647.75 | 662.69 |
| 82.00074377091858 | 28.186 | 131.873 | 631.177 | 646.034 |
| 82.16809222759392 | 28.893 | 129.429 | 613.94 | 628.672 |
| 82.33544068426926 | 29.485 | 126.83 | 596.12 | 610.696 |
| 82.50278914094459 | 29.974 | 124.127 | 580.649 | 594.997 |
| 82.67013759761994 | 30.296 | 120.894 | 568.994 | 582.936 |
| 82.83748605429528 | 30.515 | 117.192 | 558.4 | 571.802 |
| 83.00483451097062 | 30.754 | 113.574 | 545.799 | 558.743 |
| 83.17218296764597 | 30.993 | 109.946 | 533.157 | 545.643 |
| 83.33023428783935 | 31.221 | 106.234 | 521.232 | 533.23 |
| 83.4975827445147 | 31.315 | 102.637 | 510.107 | 521.616 |
| 83.66493120119004 | 31.273 | 99.341 | 499.087 | 510.159 |
| 83.83227965786537 | 31.128 | 96.222 | 488.284 | 498.941 |
| 83.99962811454073 | 30.826 | 93.061 | 478.262 | 488.482 |
| 84.16697657121607 | 30.14 | 89.589 | 470.246 | 479.936 |
| 84.33432502789142 | 29.444 | 85.929 | 463.81 | 472.887 |
| 84.50167348456677 | 28.227 | 82.457 | 459.672 | 468.156 |
| 84.6690219412421 | 27.136 | 79.078 | 455.264 | 463.207 |
| 84.83637039791745 | 26.585 | 75.896 | 449.359 | 456.865 |
| 85.0037188545928 | 25.774 | 72.965 | 445.013 | 452.145 |
| 85.17106731126813 | 24.661 | 70.563 | 439.752 | 446.604 |
| 85.33841576794349 | 23.486 | 68.047 | 433.421 | 439.96 |
| 85.50576422461883 | 22.447 | 65.229 | 425.55 | 431.778 |
| 85.66381554481221 | 21.449 | 62.329 | 417.139 | 422.972 |
| 85.83116400148755 | 20.461 | 59.428 | 408.718 | 414.176 |
| 85.99851245816289 | 19.691 | 56.309 | 399.61 | 404.694 |
| 86.16586091483823 | 19.078 | 53.159 | 389.9 | 394.609 |
| 86.33320937151358 | 18.527 | 50.164 | 379.118 | 383.495 |
| 86.50055782818893 | 18.215 | 47.181 | 368.981 | 373.067 |
| 86.66790628486427 | 17.716 | 44.332 | 358.98 | 362.754 |
| 86.83525474153961 | 17.279 | 41.67 | 348.666 | 352.18 |
| 87.00260319821496 | 16.718 | 39.175 | 339.351 | 342.605 |
| 87.16995165489031 | 16.261 | 36.961 | 330.815 | 333.861 |
| 87.33730011156564 | 15.689 | 35.432 | 323.547 | 326.469 |
| 87.504648568241 | 15.107 | 33.758 | 316.197 | 318.963 |
| 87.67199702491634 | 14.524 | 31.825 | 308.67 | 311.227 |
| 87.83004834510972 | 13.984 | 29.891 | 301.132 | 303.482 |
| 87.99739680178506 | 13.453 | 28.092 | 294.135 | 296.287 |
| 88.1647452584604 | 12.882 | 26.668 | 288.49 | 290.496 |
| 88.33209371513574 | 12.268 | 25.545 | 283.125 | 284.996 |
| 88.49944217181108 | 11.634 | 24.838 | 277.573 | 279.361 |
| 88.66679062848644 | 10.948 | 24.141 | 272.302 | 274.007 |
| 88.83413908516178 | 10.23 | 23.466 | 267.322 | 268.954 |
| 89.00148754183712 | 9.669 | 22.332 | 262.789 | 264.296 |
| 89.16883599851246 | 8.827 | 21.001 | 260.813 | 262.123 |
| 89.33618445518782 | 7.808 | 19.671 | 258.703 | 259.794 |
| 89.50353291186315 | 6.81 | 18.298 | 255.615 | 256.54 |
| 89.6708813685385 | 5.957 | 16.978 | 251.945 | 252.735 |
| 89.83822982521386 | 5.25 | 16.063 | 248.212 | 248.919 |
| 90.00557828188919 | 4.595 | 15.689 | 244.438 | 245.114 |
| 90.16362960208257 | 4.024 | 15.574 | 240.644 | 241.309 |
| 90.3309780587579 | 3.389 | 15.595 | 236.88 | 237.556 |
| 90.49832651543326 | 2.537 | 15.418 | 233.418 | 234.062 |
| 90.66567497210859 | 1.892 | 14.826 | 229.571 | 230.153 |
| 90.83302342878395 | 1.268 | 14.555 | 225.818 | 226.379 |
| 91.00037188545929 | 0.634 | 14.514 | 222.2 | 222.761 |
| 91.16772034213463 | -0.073 | 14.472 | 218.654 | 219.205 |
| 91.33506879880998 | -0.832 | 14.368 | 215.14 | 215.681 |
| 91.50241725548533 | -1.518 | 14.192 | 212.063 | 212.604 |
| 91.66976571216065 | -2.194 | 14.223 | 209.62 | 210.181 |
| 91.83711416883601 | -2.942 | 14.961 | 207.644 | 208.299 |
| 92.00446262551137 | -3.608 | 15.429 | 206.054 | 206.781 |
| 92.1718110821867 | -4.159 | 15.398 | 204.546 | 205.295 |
| 92.33915953886203 | -4.543 | 15.626 | 202.207 | 202.997 |
| 92.49721085905541 | -4.97 | 16.479 | 199.732 | 200.626 |
| 92.66455931573077 | -5.635 | 17.269 | 198.11 | 199.119 |
| 92.83190777240611 | -6.446 | 18.142 | 197.362 | 198.485 |
| 92.99925622908145 | -7.267 | 19.182 | 196.728 | 197.996 |
| 93.1666046857568 | -8.109 | 20.534 | 196.322 | 197.767 |
| 93.33395314243214 | -8.889 | 21.74 | 195.865 | 197.445 |
| 93.50130159910749 | -9.627 | 22.966 | 195.438 | 197.144 |
| 93.66865005578283 | -10.355 | 24.776 | 195.428 | 197.372 |
| 93.83599851245818 | -10.729 | 26.574 | 195.782 | 197.954 |
| 94.00334696913353 | -11.457 | 28.664 | 196.603 | 199.109 |
| 94.17069542580886 | -11.832 | 30.556 | 198.454 | 201.25 |
| 94.3380438824842 | -12.102 | 32.48 | 200.938 | 204.037 |
| 94.50539233915954 | -12.279 | 34.164 | 203.496 | 206.833 |
| 94.66344365935292 | -12.372 | 35.661 | 206.095 | 209.661 |
| 94.83079211602828 | -12.798 | 37.324 | 208.882 | 212.718 |
| 94.99814057270362 | -13.349 | 39.165 | 211.543 | 215.691 |
| 95.16548902937897 | -14.129 | 41.608 | 214.236 | 218.821 |
| 95.33283748605432 | -14.836 | 44.228 | 217.521 | 222.595 |
| 95.50018594272963 | -15.45 | 46.754 | 221.087 | 226.639 |
| 95.66753439940499 | -16.042 | 49.395 | 224.674 | 230.746 |
| 95.83488285608034 | -16.718 | 52.462 | 228.947 | 235.612 |
| 96.00223131275567 | -17.217 | 55.644 | 233.979 | 241.278 |
| 96.16957976943102 | -17.633 | 58.96 | 239.49 | 247.433 |
| 96.33692822610638 | -18.018 | 62.308 | 245.27 | 253.858 |
| 96.50427668278171 | -18.444 | 65.78 | 251.446 | 260.709 |
| 96.67162513945706 | -18.808 | 69.128 | 257.466 | 267.405 |
| 96.8389735961324 | -19.338 | 73.266 | 265.378 | 276.149 |
| 96.99702491632577 | -19.348 | 77.165 | 274.163 | 285.62 |
| 97.16437337300111 | -19.182 | 81.043 | 283.437 | 295.57 |
| 97.33172182967647 | -18.974 | 84.962 | 292.981 | 305.779 |
| 97.49907028635181 | -18.392 | 88.269 | 301.392 | 314.731 |
| 97.66641874302715 | -17.81 | 91.169 | 308.607 | 322.414 |
| 97.8337671997025 | -17.186 | 93.768 | 315.5 | 329.713 |
| 98.00111565637785 | -16.292 | 95.993 | 322.321 | 336.824 |
| 98.16846411305319 | -15.283 | 97.678 | 328.008 | 342.709 |
| 98.33581256972855 | -14.015 | 98.135 | 331.116 | 345.765 |
| 98.50316102640389 | -12.84 | 98.447 | 333.736 | 348.323 |
| 98.67050948307921 | -11.717 | 99.258 | 337.24 | 351.858 |
| 98.83785793975456 | -10.272 | 97.314 | 336.907 | 351.005 |
| 99.0052063964299 | -8.931 | 95.12 | 336.325 | 349.851 |
| 99.17255485310525 | -7.59 | 92.947 | 335.764 | 348.739 |
| 99.33060617329863 | -6.498 | 91.211 | 336.284 | 348.801 |
| 99.49795462997399 | -5.521 | 90.369 | 338.165 | 350.413 |
| 99.66530308664933 | -4.585 | 89.755 | 340.401 | 352.419 |
| 99.83265154332467 | -3.483 | 88.508 | 342.054 | 353.709 |
| 100.0 | -2.547 | 87.884 | 344.289 | 355.715 |